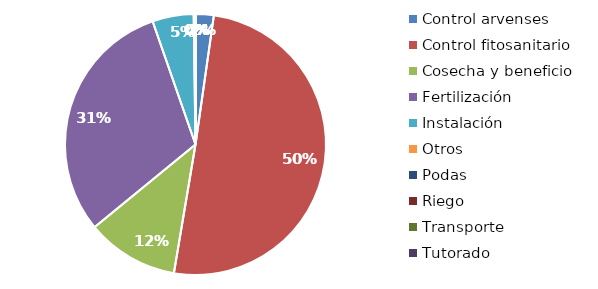
| Category | Valor |
|---|---|
| Control arvenses | 555876 |
| Control fitosanitario | 12445247 |
| Cosecha y beneficio | 2822205.026 |
| Fertilización | 7555906 |
| Instalación | 1261138.554 |
| Otros | 54906 |
| Podas | 0 |
| Riego | 0 |
| Transporte | 0 |
| Tutorado | 0 |